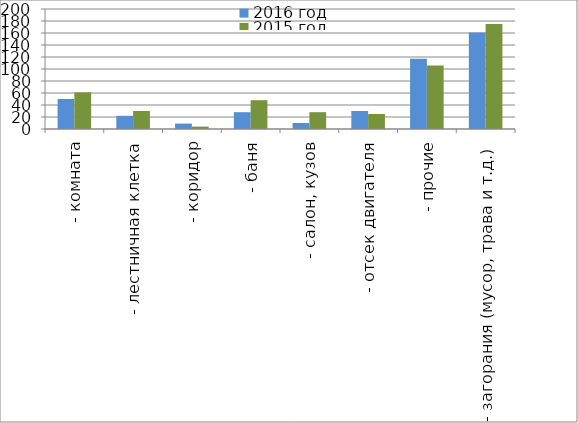
| Category | 2016 год | 2015 год |
|---|---|---|
|  - комната | 50 | 61 |
|  - лестничная клетка | 22 | 30 |
|  - коридор | 9 | 4 |
|  - баня | 28 | 48 |
|  - салон, кузов | 10 | 28 |
|  - отсек двигателя | 30 | 25 |
| - прочие | 117 | 106 |
| - загорания (мусор, трава и т.д.)  | 161 | 175 |